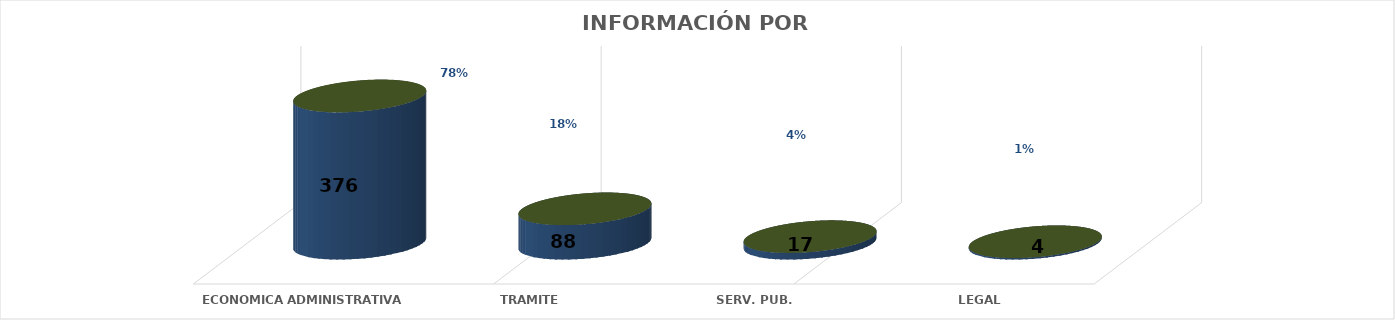
| Category | Series 0 | Series 1 | Series 2 | Series 3 | Series 4 |
|---|---|---|---|---|---|
| ECONOMICA ADMINISTRATIVA |  |  |  | 376 | 0.775 |
| TRAMITE |  |  |  | 88 | 0.181 |
| SERV. PUB. |  |  |  | 17 | 0.035 |
| LEGAL |  |  |  | 4 | 0.008 |